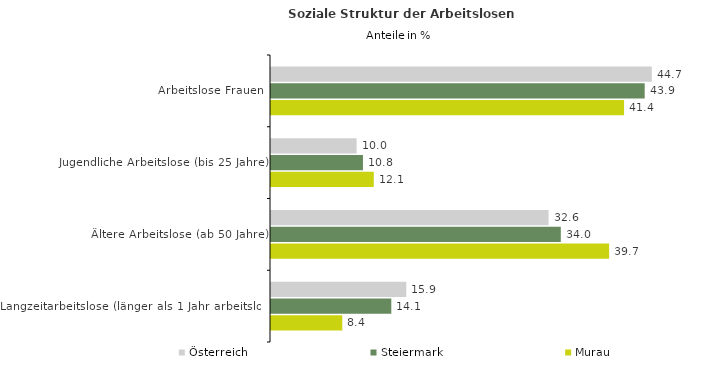
| Category | Österreich | Steiermark | Murau |
|---|---|---|---|
| Arbeitslose Frauen | 44.699 | 43.86 | 41.44 |
| Jugendliche Arbeitslose (bis 25 Jahre) | 10.046 | 10.794 | 12.062 |
| Ältere Arbeitslose (ab 50 Jahre) | 32.578 | 34.015 | 39.689 |
| Langzeitarbeitslose (länger als 1 Jahr arbeitslos) | 15.879 | 14.12 | 8.366 |